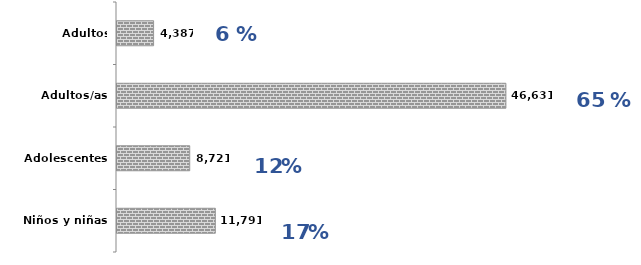
| Category | Series 0 |
|---|---|
| Niños y niñas | 11791 |
| Adolescentes | 8721 |
| Adultos/as | 46631 |
| Adultos mayores | 4387 |